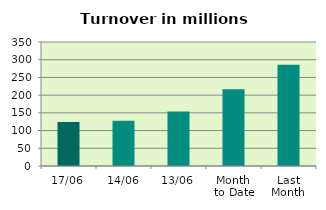
| Category | Series 0 |
|---|---|
| 17/06 | 124.179 |
| 14/06 | 127.43 |
| 13/06 | 154.081 |
| Month 
to Date | 216.974 |
| Last
Month | 285.992 |